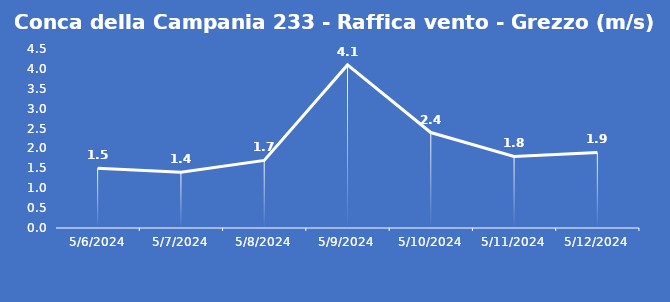
| Category | Conca della Campania 233 - Raffica vento - Grezzo (m/s) |
|---|---|
| 5/6/24 | 1.5 |
| 5/7/24 | 1.4 |
| 5/8/24 | 1.7 |
| 5/9/24 | 4.1 |
| 5/10/24 | 2.4 |
| 5/11/24 | 1.8 |
| 5/12/24 | 1.9 |